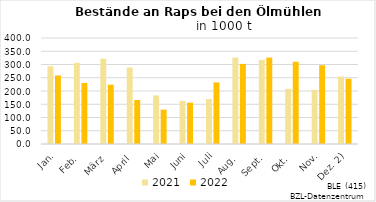
| Category | 2021 | 2022 |
|---|---|---|
| Jan. | 293.106 | 258.562 |
| Feb. | 305.777 | 230.219 |
| März | 321.943 | 223.855 |
| April | 288.722 | 166.136 |
| Mai | 183.234 | 129.735 |
| Juni | 162.484 | 155.931 |
| Juli | 169.639 | 232.371 |
| Aug. | 326.152 | 302.268 |
| Sept. | 317.347 | 326.046 |
| Okt. | 207.873 | 310.279 |
| Nov. | 204.503 | 297.286 |
| Dez. 2) | 254.701 | 246.141 |